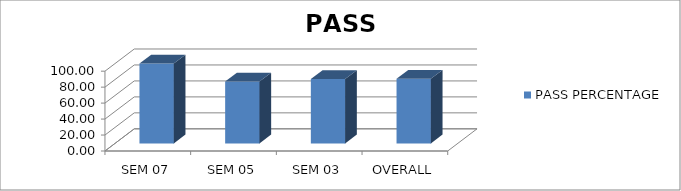
| Category | PASS PERCENTAGE |
|---|---|
| SEM 07 | 100 |
| SEM 05 | 77.5 |
| SEM 03 | 80.645 |
| OVERALL | 80.921 |